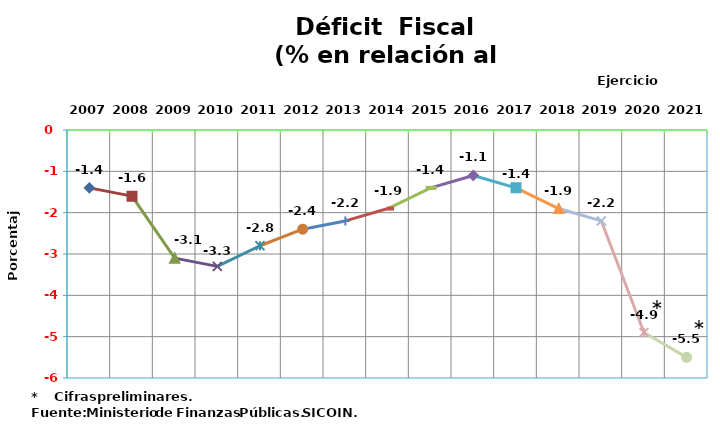
| Category | Series 0 |
|---|---|
| 2007 | -1.4 |
| 2008 | -1.6 |
| 2009 | -3.1 |
| 2010 | -3.3 |
| 2011 | -2.8 |
| 2012 | -2.4 |
| 2013 | -2.2 |
| 2014 | -1.9 |
| 2015 | -1.4 |
| 2016 | -1.1 |
| 2017 | -1.4 |
| 2018 | -1.9 |
| 2019 | -2.2 |
| 2020 | -4.9 |
| 2021 | -5.5 |